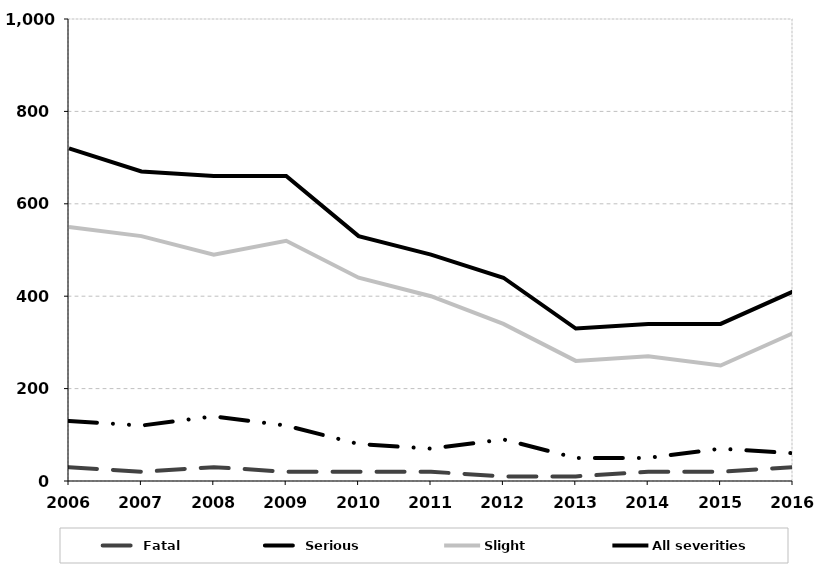
| Category | Fatal | Serious | Slight | All severities |
|---|---|---|---|---|
| 2006.0 | 30 | 130 | 550 | 720 |
| 2007.0 | 20 | 120 | 530 | 670 |
| 2008.0 | 30 | 140 | 490 | 660 |
| 2009.0 | 20 | 120 | 520 | 660 |
| 2010.0 | 20 | 80 | 440 | 530 |
| 2011.0 | 20 | 70 | 400 | 490 |
| 2012.0 | 10 | 90 | 340 | 440 |
| 2013.0 | 10 | 50 | 260 | 330 |
| 2014.0 | 20 | 50 | 270 | 340 |
| 2015.0 | 20 | 70 | 250 | 340 |
| 2016.0 | 30 | 60 | 320 | 410 |